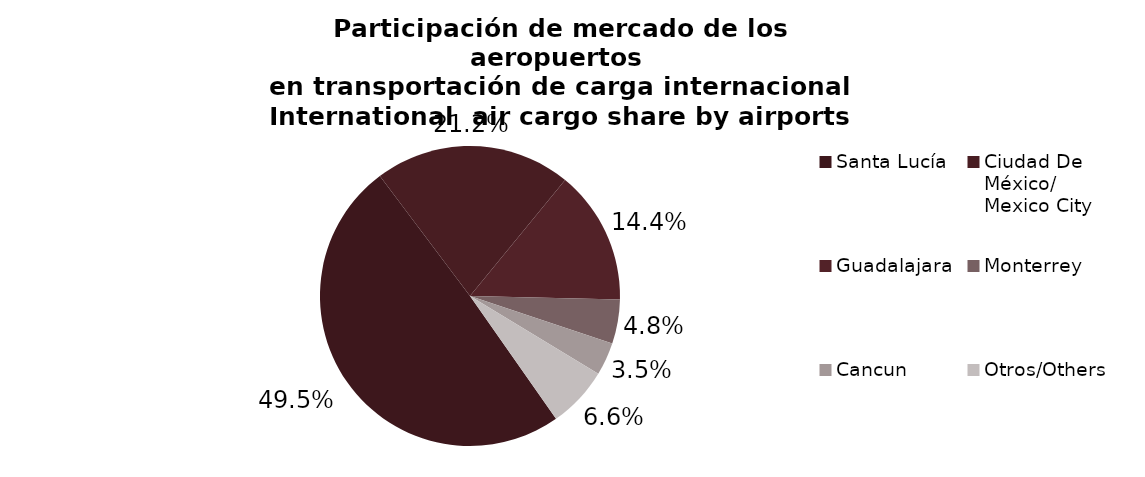
| Category | Series 0 |
|---|---|
| Santa Lucía | 36631.652 |
| Ciudad De 
México/
Mexico City | 15695.4 |
| Guadalajara | 10697.966 |
| Monterrey | 3525.656 |
| Cancun | 2622.523 |
| Otros/Others | 4889.186 |